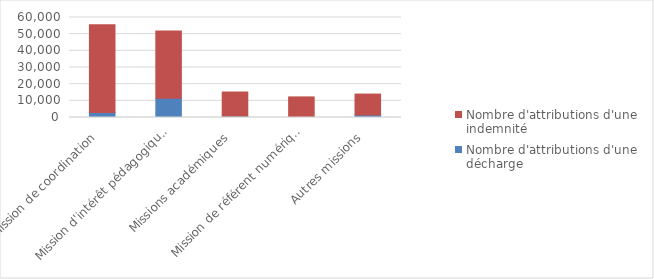
| Category | Nombre d'attributions d'une décharge | Nombre d'attributions d'une indemnité |
|---|---|---|
| Mission de coordination | 2994 | 52712 |
| Mission d'intérêt pédagogique et éducatif | 11531 | 40431 |
| Missions académiques | 873 | 14416 |
| Mission de référent numérique | 340 | 12016 |
| Autres missions | 1503 | 12552 |